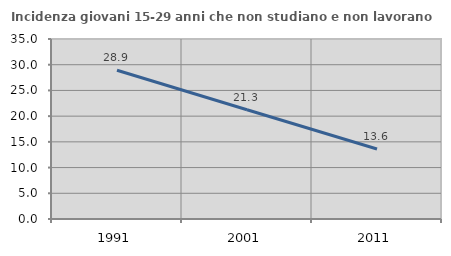
| Category | Incidenza giovani 15-29 anni che non studiano e non lavorano  |
|---|---|
| 1991.0 | 28.924 |
| 2001.0 | 21.25 |
| 2011.0 | 13.609 |